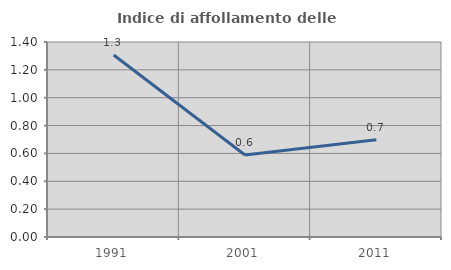
| Category | Indice di affollamento delle abitazioni  |
|---|---|
| 1991.0 | 1.307 |
| 2001.0 | 0.589 |
| 2011.0 | 0.699 |